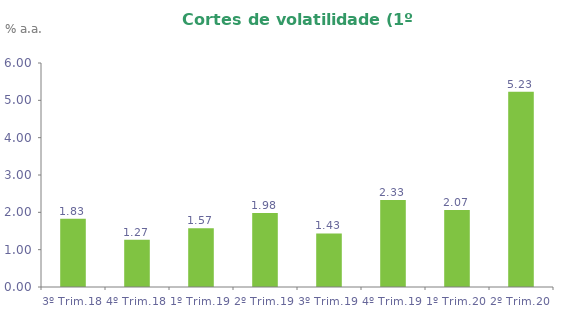
| Category | Series 0 |
|---|---|
| 3º Trim.18 | 1.827 |
| 4º Trim.18 | 1.268 |
| 1º Trim.19 | 1.573 |
| 2º Trim.19 | 1.98 |
| 3º Trim.19 | 1.435 |
| 4º Trim.19 | 2.33 |
| 1º Trim.20 | 2.065 |
| 2º Trim.20 | 5.231 |